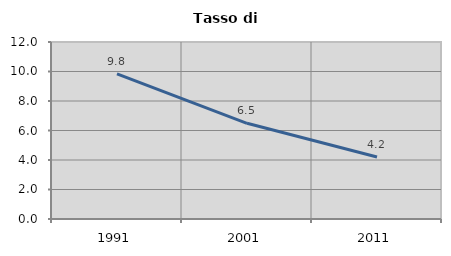
| Category | Tasso di disoccupazione   |
|---|---|
| 1991.0 | 9.843 |
| 2001.0 | 6.489 |
| 2011.0 | 4.206 |